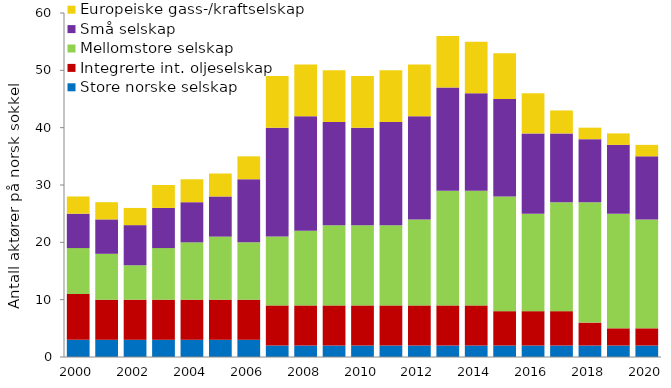
| Category | Store norske selskap | Integrerte int. oljeselskap | Mellomstore selskap | Små selskap | Europeiske gass-/kraftselskap |
|---|---|---|---|---|---|
| 2000.0 | 3 | 8 | 8 | 6 | 3 |
| 2001.0 | 3 | 7 | 8 | 6 | 3 |
| 2002.0 | 3 | 7 | 6 | 7 | 3 |
| 2003.0 | 3 | 7 | 9 | 7 | 4 |
| 2004.0 | 3 | 7 | 10 | 7 | 4 |
| 2005.0 | 3 | 7 | 11 | 7 | 4 |
| 2006.0 | 3 | 7 | 10 | 11 | 4 |
| 2007.0 | 2 | 7 | 12 | 19 | 9 |
| 2008.0 | 2 | 7 | 13 | 20 | 9 |
| 2009.0 | 2 | 7 | 14 | 18 | 9 |
| 2010.0 | 2 | 7 | 14 | 17 | 9 |
| 2011.0 | 2 | 7 | 14 | 18 | 9 |
| 2012.0 | 2 | 7 | 15 | 18 | 9 |
| 2013.0 | 2 | 7 | 20 | 18 | 9 |
| 2014.0 | 2 | 7 | 20 | 17 | 9 |
| 2015.0 | 2 | 6 | 20 | 17 | 8 |
| 2016.0 | 2 | 6 | 17 | 14 | 7 |
| 2017.0 | 2 | 6 | 19 | 12 | 4 |
| 2018.0 | 2 | 4 | 21 | 11 | 2 |
| 2019.0 | 2 | 3 | 20 | 12 | 2 |
| 2020.0 | 2 | 3 | 19 | 11 | 2 |